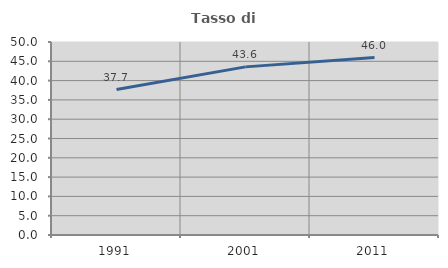
| Category | Tasso di occupazione   |
|---|---|
| 1991.0 | 37.692 |
| 2001.0 | 43.557 |
| 2011.0 | 45.967 |